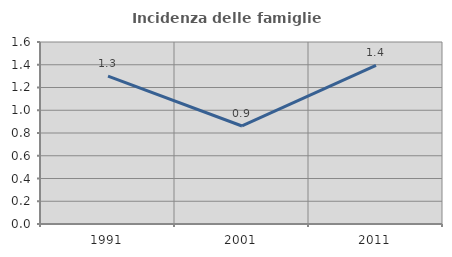
| Category | Incidenza delle famiglie numerose |
|---|---|
| 1991.0 | 1.3 |
| 2001.0 | 0.862 |
| 2011.0 | 1.394 |